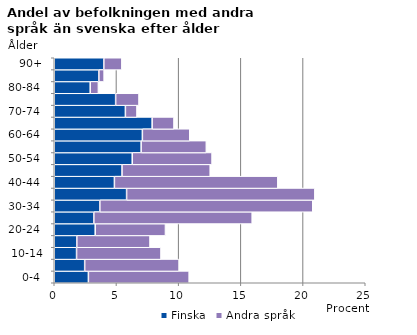
| Category | Finska | Andra språk |
|---|---|---|
|   0-4  | 2.744 | 8.099 |
|   5-9  | 2.446 | 7.584 |
| 10-14 | 1.793 | 6.786 |
| 15-19  | 1.815 | 5.882 |
| 20-24  | 3.293 | 5.645 |
| 25-29  | 3.182 | 12.728 |
| 30-34  | 3.667 | 17.113 |
| 35-39  | 5.816 | 15.133 |
| 40-44  | 4.834 | 13.137 |
| 45-49  | 5.448 | 7.088 |
| 50-54  | 6.269 | 6.417 |
| 55-59  | 6.985 | 5.239 |
| 60-64  | 7.084 | 3.81 |
| 65-69  | 7.87 | 1.754 |
| 70-74  | 5.718 | 0.931 |
| 75-79  | 4.936 | 1.876 |
| 80-84  | 2.891 | 0.657 |
| 85-89  | 3.586 | 0.422 |
| 90+ | 3.986 | 1.449 |